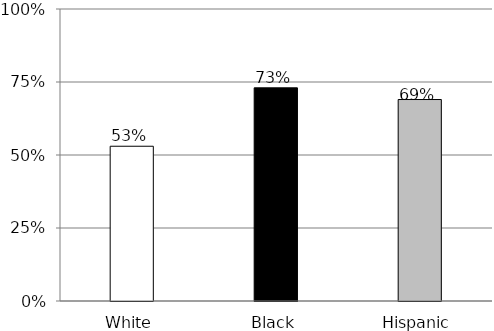
| Category | Series 0 |
|---|---|
| White | 0.53 |
| Black | 0.73 |
| Hispanic | 0.69 |